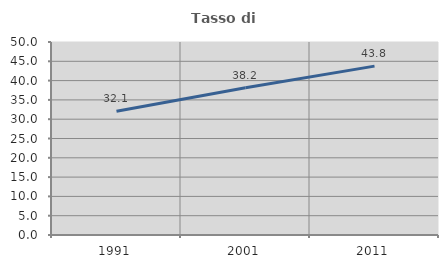
| Category | Tasso di occupazione   |
|---|---|
| 1991.0 | 32.051 |
| 2001.0 | 38.165 |
| 2011.0 | 43.75 |